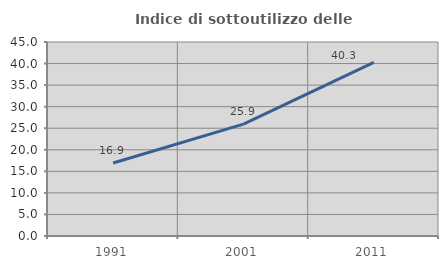
| Category | Indice di sottoutilizzo delle abitazioni  |
|---|---|
| 1991.0 | 16.94 |
| 2001.0 | 25.946 |
| 2011.0 | 40.274 |